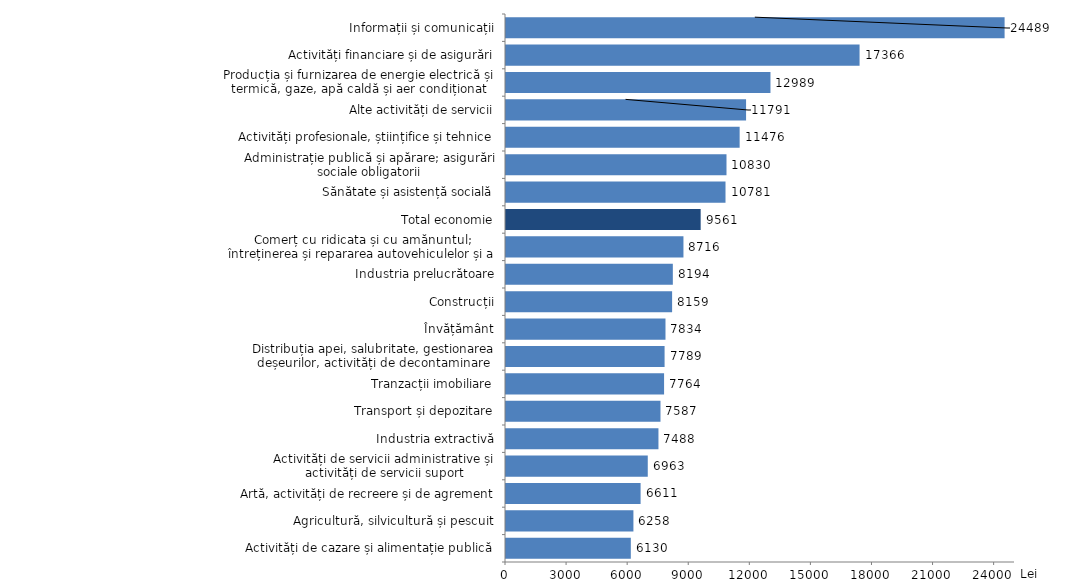
| Category | Lei |
|---|---|
| Activități de cazare și alimentație publică | 6130.4 |
| Agricultură, silvicultură și pescuit | 6258.2 |
| Artă, activități de recreere și de agrement | 6610.7 |
| Activități de servicii administrative și activități de servicii suport | 6963 |
| Industria extractivă | 7487.9 |
| Transport și depozitare | 7587.4 |
| Tranzacții imobiliare | 7764 |
| Distribuția apei, salubritate, gestionarea deșeurilor, activități de decontaminare | 7788.9 |
| Învățământ | 7833.6 |
| Construcții | 8158.8 |
| Industria prelucrătoare | 8194.2 |
| Comerț cu ridicata și cu amănuntul; întreținerea și repararea autovehiculelor și a motocicletelor | 8715.6 |
| Total economie | 9560.8 |
| Sănătate și asistență socială | 10781.4 |
| Administrație publică și apărare; asigurări sociale obligatorii | 10829.8 |
| Activități profesionale, științifice și tehnice | 11475.7 |
| Alte activități de servicii | 11791.3 |
| Producția și furnizarea de energie electrică și termică, gaze, apă caldă și aer condiționat | 12989.4 |
| Activități financiare și de asigurări | 17365.9 |
| Informații și comunicații | 24489 |